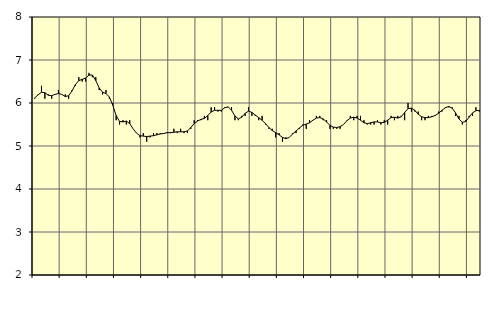
| Category | Piggar | Transport, SNI 49-53 |
|---|---|---|
| nan | 6.1 | 6.12 |
| 87.0 | 6.2 | 6.19 |
| 87.0 | 6.4 | 6.25 |
| 87.0 | 6.1 | 6.24 |
| nan | 6.2 | 6.18 |
| 88.0 | 6.1 | 6.17 |
| 88.0 | 6.2 | 6.2 |
| 88.0 | 6.3 | 6.22 |
| nan | 6.2 | 6.2 |
| 89.0 | 6.2 | 6.15 |
| 89.0 | 6.1 | 6.17 |
| 89.0 | 6.3 | 6.28 |
| nan | 6.4 | 6.43 |
| 90.0 | 6.6 | 6.52 |
| 90.0 | 6.5 | 6.55 |
| 90.0 | 6.5 | 6.58 |
| nan | 6.7 | 6.65 |
| 91.0 | 6.6 | 6.65 |
| 91.0 | 6.6 | 6.52 |
| 91.0 | 6.3 | 6.35 |
| nan | 6.2 | 6.25 |
| 92.0 | 6.3 | 6.22 |
| 92.0 | 6.1 | 6.14 |
| 92.0 | 6 | 5.95 |
| nan | 5.6 | 5.71 |
| 93.0 | 5.5 | 5.57 |
| 93.0 | 5.6 | 5.56 |
| 93.0 | 5.5 | 5.58 |
| nan | 5.6 | 5.52 |
| 94.0 | 5.4 | 5.4 |
| 94.0 | 5.3 | 5.3 |
| 94.0 | 5.2 | 5.24 |
| nan | 5.3 | 5.23 |
| 95.0 | 5.1 | 5.22 |
| 95.0 | 5.2 | 5.23 |
| 95.0 | 5.3 | 5.24 |
| nan | 5.3 | 5.26 |
| 96.0 | 5.3 | 5.28 |
| 96.0 | 5.3 | 5.29 |
| 96.0 | 5.3 | 5.31 |
| nan | 5.3 | 5.31 |
| 97.0 | 5.4 | 5.32 |
| 97.0 | 5.3 | 5.33 |
| 97.0 | 5.4 | 5.33 |
| nan | 5.3 | 5.33 |
| 98.0 | 5.3 | 5.35 |
| 98.0 | 5.4 | 5.43 |
| 98.0 | 5.6 | 5.52 |
| nan | 5.6 | 5.58 |
| 99.0 | 5.6 | 5.62 |
| 99.0 | 5.7 | 5.64 |
| 99.0 | 5.6 | 5.71 |
| nan | 5.9 | 5.79 |
| 0.0 | 5.9 | 5.83 |
| 0.0 | 5.8 | 5.83 |
| 0.0 | 5.8 | 5.83 |
| nan | 5.9 | 5.89 |
| 1.0 | 5.9 | 5.91 |
| 1.0 | 5.9 | 5.83 |
| 1.0 | 5.6 | 5.7 |
| nan | 5.6 | 5.63 |
| 2.0 | 5.7 | 5.67 |
| 2.0 | 5.7 | 5.76 |
| 2.0 | 5.9 | 5.81 |
| nan | 5.7 | 5.78 |
| 3.0 | 5.7 | 5.72 |
| 3.0 | 5.6 | 5.66 |
| 3.0 | 5.7 | 5.6 |
| nan | 5.5 | 5.52 |
| 4.0 | 5.4 | 5.43 |
| 4.0 | 5.4 | 5.36 |
| 4.0 | 5.2 | 5.31 |
| nan | 5.3 | 5.26 |
| 5.0 | 5.1 | 5.2 |
| 5.0 | 5.2 | 5.17 |
| 5.0 | 5.2 | 5.2 |
| nan | 5.3 | 5.28 |
| 6.0 | 5.3 | 5.35 |
| 6.0 | 5.4 | 5.42 |
| 6.0 | 5.5 | 5.48 |
| nan | 5.4 | 5.51 |
| 7.0 | 5.6 | 5.54 |
| 7.0 | 5.6 | 5.6 |
| 7.0 | 5.7 | 5.65 |
| nan | 5.7 | 5.66 |
| 8.0 | 5.6 | 5.63 |
| 8.0 | 5.6 | 5.56 |
| 8.0 | 5.4 | 5.48 |
| nan | 5.4 | 5.44 |
| 9.0 | 5.4 | 5.43 |
| 9.0 | 5.4 | 5.45 |
| 9.0 | 5.5 | 5.5 |
| nan | 5.6 | 5.59 |
| 10.0 | 5.7 | 5.65 |
| 10.0 | 5.6 | 5.67 |
| 10.0 | 5.7 | 5.65 |
| nan | 5.7 | 5.6 |
| 11.0 | 5.6 | 5.54 |
| 11.0 | 5.5 | 5.52 |
| 11.0 | 5.5 | 5.54 |
| nan | 5.5 | 5.56 |
| 12.0 | 5.6 | 5.56 |
| 12.0 | 5.5 | 5.54 |
| 12.0 | 5.6 | 5.55 |
| nan | 5.5 | 5.6 |
| 13.0 | 5.7 | 5.66 |
| 13.0 | 5.6 | 5.67 |
| 13.0 | 5.7 | 5.65 |
| nan | 5.7 | 5.68 |
| 14.0 | 5.6 | 5.78 |
| 14.0 | 6 | 5.87 |
| 14.0 | 5.8 | 5.88 |
| nan | 5.8 | 5.83 |
| 15.0 | 5.8 | 5.74 |
| 15.0 | 5.6 | 5.68 |
| 15.0 | 5.6 | 5.66 |
| nan | 5.7 | 5.66 |
| 16.0 | 5.7 | 5.68 |
| 16.0 | 5.7 | 5.71 |
| 16.0 | 5.8 | 5.76 |
| nan | 5.8 | 5.83 |
| 17.0 | 5.9 | 5.89 |
| 17.0 | 5.9 | 5.92 |
| 17.0 | 5.9 | 5.88 |
| nan | 5.7 | 5.77 |
| 18.0 | 5.7 | 5.63 |
| 18.0 | 5.5 | 5.55 |
| 18.0 | 5.6 | 5.57 |
| nan | 5.7 | 5.67 |
| 19.0 | 5.7 | 5.77 |
| 19.0 | 5.9 | 5.82 |
| 19.0 | 5.8 | 5.83 |